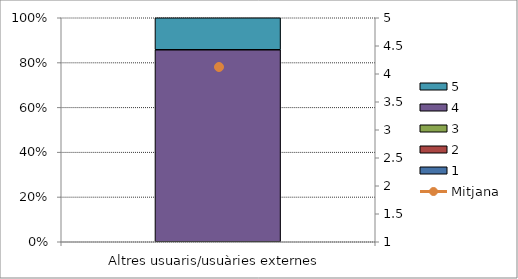
| Category | 1 | 2 | 3 | 4 | 5 |
|---|---|---|---|---|---|
| Altres usuaris/usuàries externes | 0 | 0 | 0 | 6 | 1 |